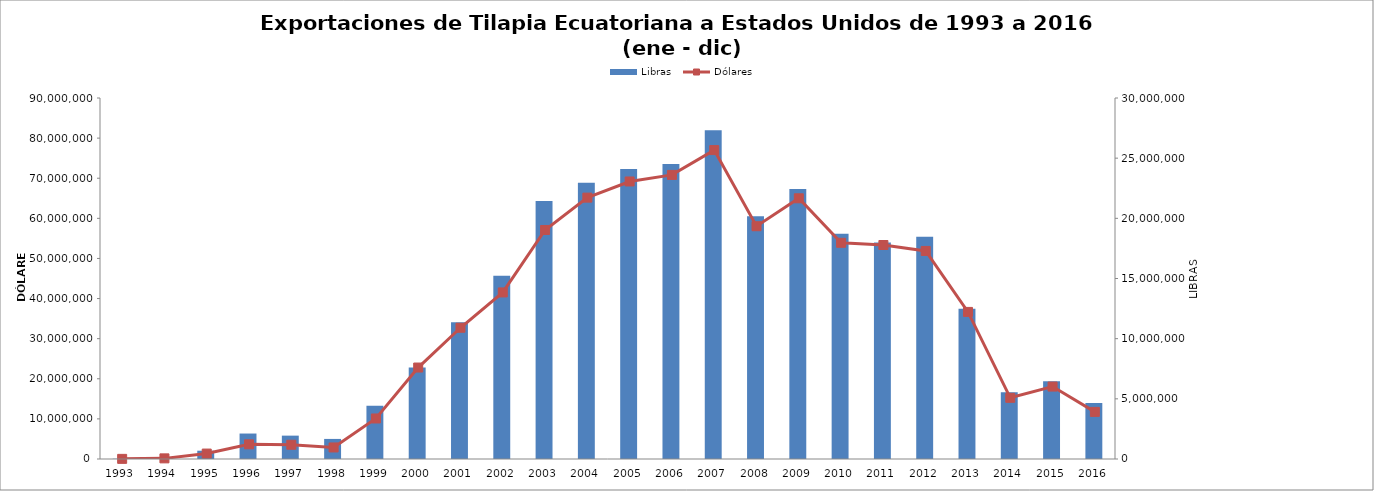
| Category | Libras |
|---|---|
| 1993.0 | 21730.742 |
| 1994.0 | 88499.258 |
| 1995.0 | 689457.786 |
| 1996.0 | 2116647.483 |
| 1997.0 | 1941708.064 |
| 1998.0 | 1668547.101 |
| 1999.0 | 4434656.516 |
| 2000.0 | 7599686.097 |
| 2001.0 | 11373890.75 |
| 2002.0 | 15219326.029 |
| 2003.0 | 21443302.043 |
| 2004.0 | 22953708.776 |
| 2005.0 | 24101028.913 |
| 2006.0 | 24512713.712 |
| 2007.0 | 27315395.237 |
| 2008.0 | 20170218.295 |
| 2009.0 | 22438586.35 |
| 2010.0 | 18724421.773 |
| 2011.0 | 17995543.535 |
| 2012.0 | 18477544.051 |
| 2013.0 | 12494087.693 |
| 2014.0 | 5552509.969 |
| 2015.0 | 6465454.516 |
| 2016.0 | 4663040.341 |